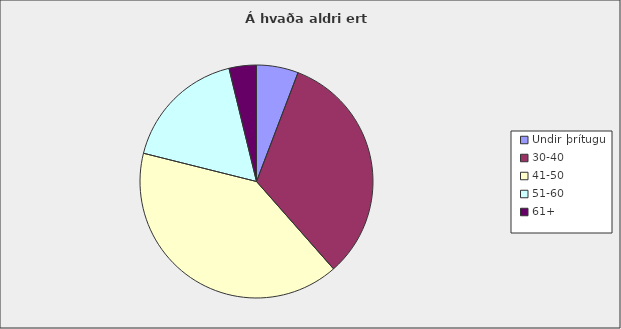
| Category | Series 0 |
|---|---|
| Undir þrítugu | 0.058 |
| 30-40 | 0.327 |
| 41-50 | 0.404 |
| 51-60 | 0.173 |
| 61+ | 0.038 |